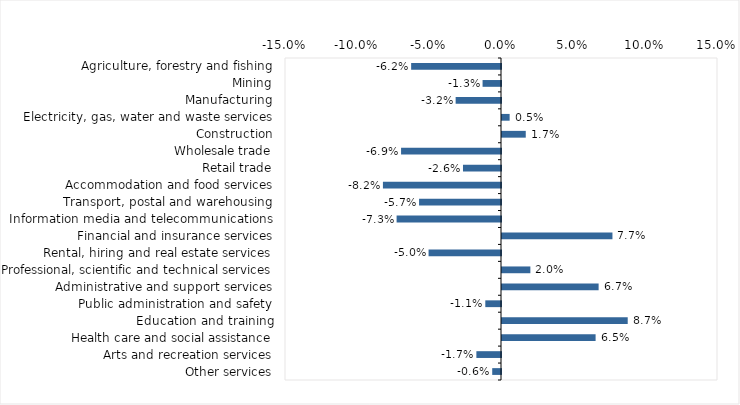
| Category | This week |
|---|---|
| Agriculture, forestry and fishing | -0.062 |
| Mining | -0.013 |
| Manufacturing | -0.032 |
| Electricity, gas, water and waste services | 0.005 |
| Construction | 0.016 |
| Wholesale trade | -0.069 |
| Retail trade | -0.026 |
| Accommodation and food services | -0.082 |
| Transport, postal and warehousing | -0.057 |
| Information media and telecommunications | -0.072 |
| Financial and insurance services | 0.077 |
| Rental, hiring and real estate services | -0.05 |
| Professional, scientific and technical services | 0.02 |
| Administrative and support services | 0.067 |
| Public administration and safety | -0.011 |
| Education and training | 0.087 |
| Health care and social assistance | 0.065 |
| Arts and recreation services | -0.017 |
| Other services | -0.006 |